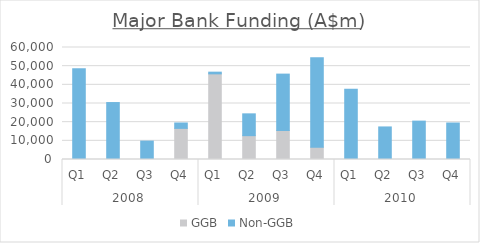
| Category | GGB | Non-GGB |
|---|---|---|
| 0 | 0 | 48670.821 |
| 1 | 0 | 30509.674 |
| 2 | 0 | 9859.427 |
| 3 | 16673.913 | 2881.437 |
| 4 | 45878.363 | 913.478 |
| 5 | 12771.166 | 11687.624 |
| 6 | 15536.601 | 30209.167 |
| 7 | 6625.795 | 47949.931 |
| 8 | 0 | 37617.791 |
| 9 | 0 | 17444.59 |
| 10 | 0 | 20559.462 |
| 11 | 0 | 19544.128 |